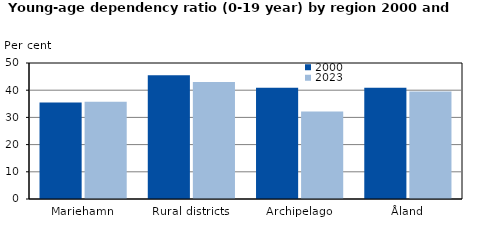
| Category | 2000 | 2023 |
|---|---|---|
| Mariehamn | 35.463 | 35.798 |
| Rural districts | 45.524 | 43.001 |
| Archipelago | 40.92 | 32.139 |
| Åland | 40.872 | 39.542 |